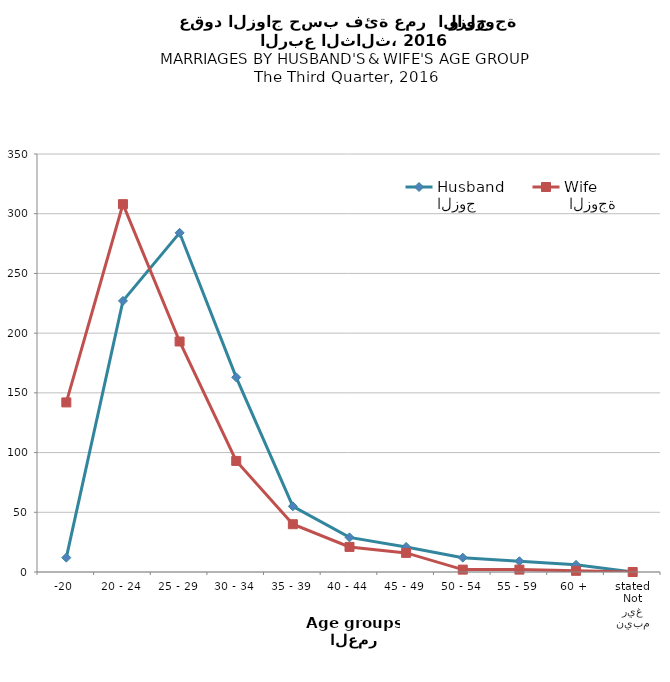
| Category | الزوج
Husband |  الزوجة
Wife |
|---|---|---|
| -20 | 12 | 142 |
| 20 - 24 | 227 | 308 |
| 25 - 29 | 284 | 193 |
| 30 - 34 | 163 | 93 |
| 35 - 39 | 55 | 40 |
| 40 - 44 | 29 | 21 |
| 45 - 49 | 21 | 16 |
| 50 - 54 | 12 | 2 |
| 55 - 59 | 9 | 2 |
| 60 + | 6 | 1 |
| غير مبين
Not stated | 0 | 0 |